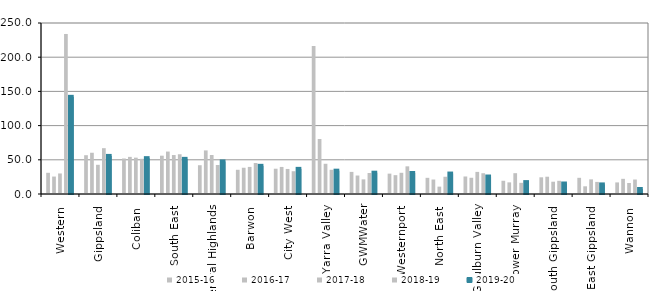
| Category | 2015-16 | 2016-17 | 2017-18 | 2018-19 | 2019-20 |
|---|---|---|---|---|---|
| Western  | 31 | 25.5 | 30.026 | 233.967 | 142.061 |
| Gippsland  | 56.722 | 60.304 | 42.684 | 67 | 55.667 |
| Coliban  | 51.911 | 54.268 | 53.132 | 51.449 | 52.411 |
| South East  | 56.005 | 62.043 | 56.97 | 58.111 | 51.381 |
| Central Highlands  | 42.062 | 63.729 | 57.009 | 42.37 | 47.607 |
| Barwon  | 35.399 | 38.364 | 39.602 | 45.361 | 41.185 |
| City West  | 36.957 | 39.551 | 36.605 | 33.299 | 36.744 |
| Yarra Valley  | 216.554 | 80.386 | 44.182 | 35.404 | 34.101 |
| GWMWater | 32.325 | 27 | 21.388 | 30.717 | 31.143 |
| Westernport  | 29.763 | 27.542 | 31 | 40.431 | 30.692 |
| North East  | 23.636 | 21.158 | 10.75 | 25.222 | 29.9 |
| Goulburn Valley  | 25.609 | 23.732 | 32.328 | 30.345 | 25.554 |
| Lower Murray  | 19.348 | 17.016 | 30.442 | 16.318 | 17.391 |
| South Gippsland  | 24.415 | 25.268 | 17.971 | 19.286 | 15.353 |
| East Gippsland  | 23.667 | 11.25 | 21.4 | 17.667 | 14 |
| Wannon  | 16.944 | 22.176 | 16.063 | 21.149 | 7.35 |